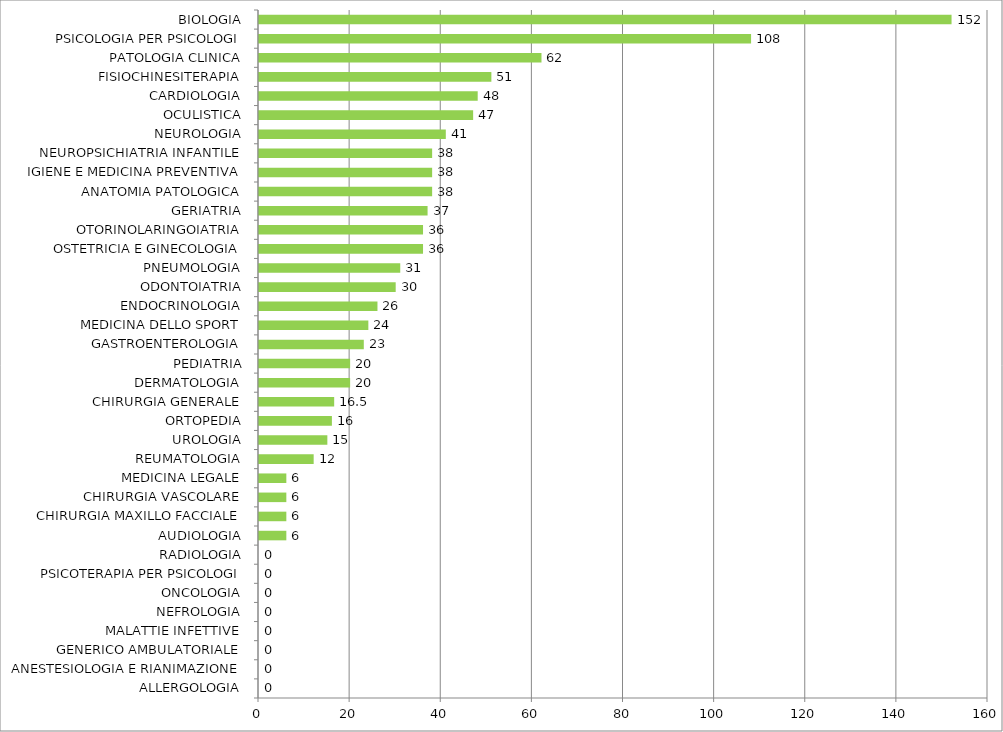
| Category | Series 0 |
|---|---|
| ALLERGOLOGIA | 0 |
| ANESTESIOLOGIA E RIANIMAZIONE | 0 |
| GENERICO AMBULATORIALE | 0 |
| MALATTIE INFETTIVE | 0 |
| NEFROLOGIA | 0 |
| ONCOLOGIA | 0 |
| PSICOTERAPIA PER PSICOLOGI | 0 |
| RADIOLOGIA | 0 |
| AUDIOLOGIA | 6 |
| CHIRURGIA MAXILLO FACCIALE | 6 |
| CHIRURGIA VASCOLARE | 6 |
| MEDICINA LEGALE | 6 |
| REUMATOLOGIA | 12 |
| UROLOGIA | 15 |
| ORTOPEDIA | 16 |
| CHIRURGIA GENERALE | 16.5 |
| DERMATOLOGIA | 20 |
| PEDIATRIA | 20 |
| GASTROENTEROLOGIA | 23 |
| MEDICINA DELLO SPORT | 24 |
| ENDOCRINOLOGIA | 26 |
| ODONTOIATRIA | 30 |
| PNEUMOLOGIA | 31 |
| OSTETRICIA E GINECOLOGIA | 36 |
| OTORINOLARINGOIATRIA | 36 |
| GERIATRIA | 37 |
| ANATOMIA PATOLOGICA | 38 |
| IGIENE E MEDICINA PREVENTIVA | 38 |
| NEUROPSICHIATRIA INFANTILE | 38 |
| NEUROLOGIA | 41 |
| OCULISTICA | 47 |
| CARDIOLOGIA | 48 |
| FISIOCHINESITERAPIA | 51 |
| PATOLOGIA CLINICA | 62 |
| PSICOLOGIA PER PSICOLOGI | 108 |
| BIOLOGIA | 152 |